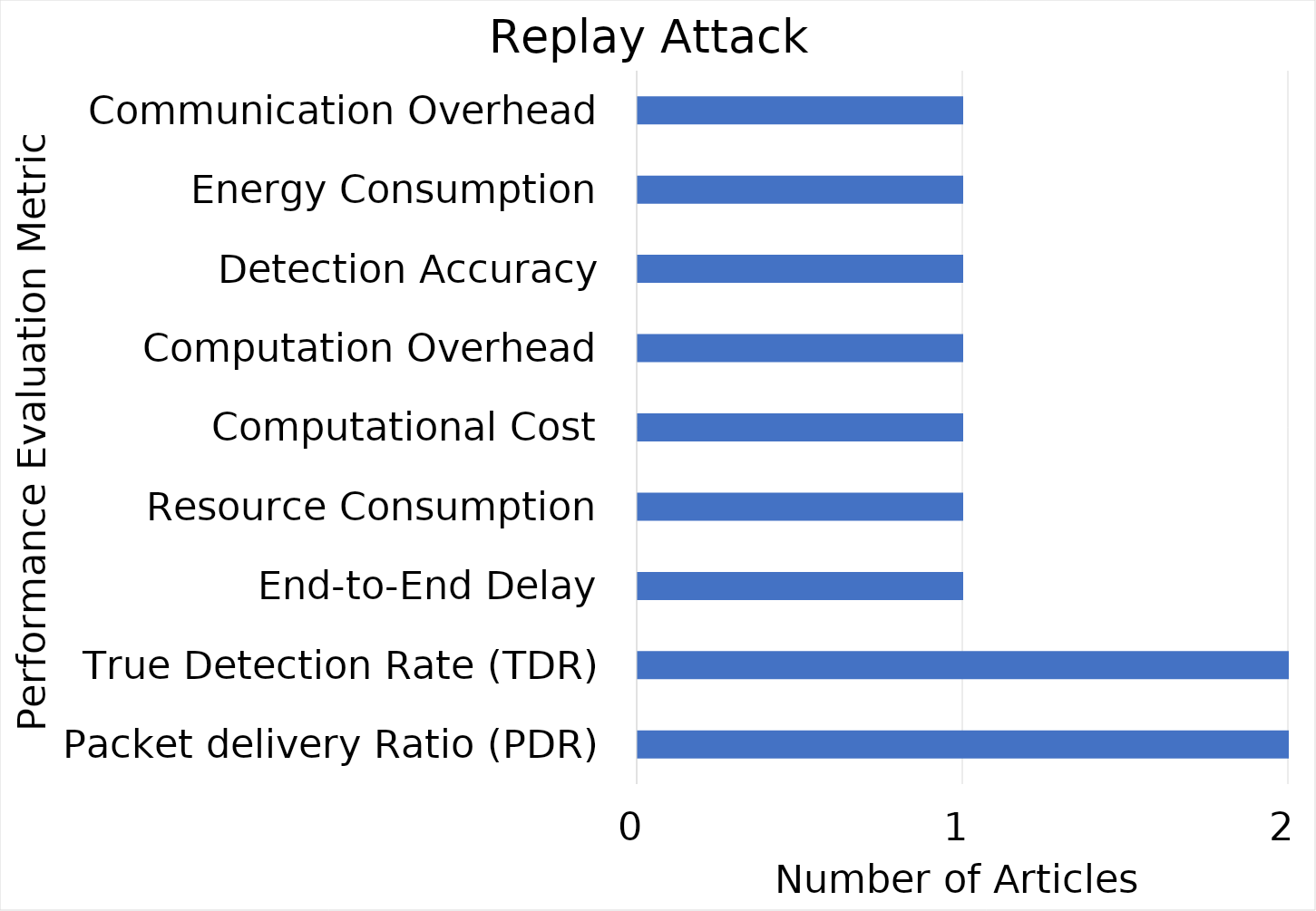
| Category | Replay |
|---|---|
| Packet delivery Ratio (PDR) | 2 |
| True Detection Rate (TDR) | 2 |
| End-to-End Delay | 1 |
| Resource Consumption | 1 |
| Computational Cost | 1 |
| Computation Overhead | 1 |
| Detection Accuracy | 1 |
| Energy Consumption | 1 |
| Communication Overhead | 1 |